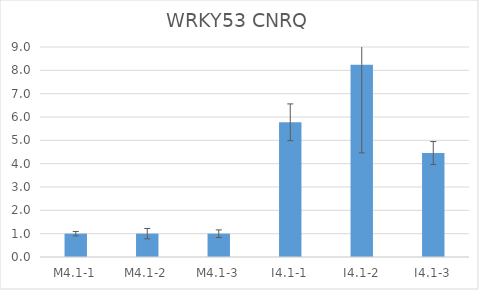
| Category | WRKY53 CNRQ |
|---|---|
| M4.1-1 | 1 |
| M4.1-2 | 1 |
| M4.1-3 | 1 |
| I4.1-1 | 5.774 |
| I4.1-2 | 8.244 |
| I4.1-3 | 4.456 |